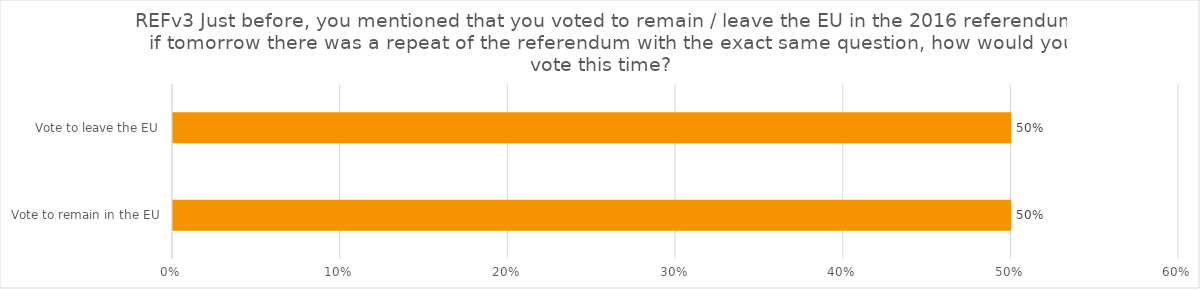
| Category | REFv3 Just before, you mentioned that you voted to remain / leave the EU in the 2016 referendum, if tomorrow there was a repeat of the referendum with the exact same question, how would you vote this time? |
|---|---|
| Vote to remain in the EU | 0.5 |
| Vote to leave the EU | 0.5 |